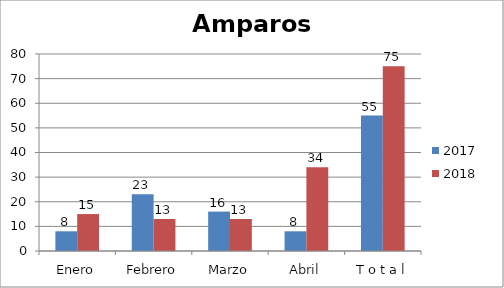
| Category | 2017 | 2018 |
|---|---|---|
| Enero | 8 | 15 |
| Febrero | 23 | 13 |
| Marzo | 16 | 13 |
| Abril | 8 | 34 |
| T o t a l | 55 | 75 |